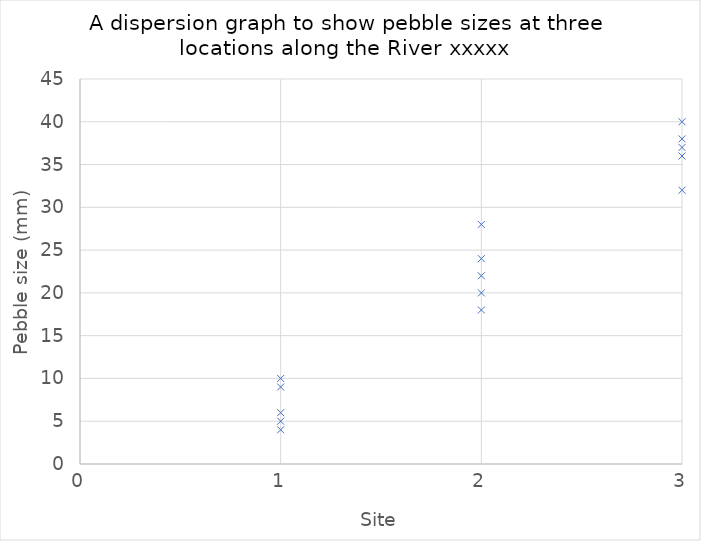
| Category | Series 0 |
|---|---|
| 1.0 | 5 |
| 1.0 | 9 |
| 1.0 | 6 |
| 1.0 | 10 |
| 1.0 | 4 |
| 2.0 | 18 |
| 2.0 | 20 |
| 2.0 | 24 |
| 2.0 | 22 |
| 2.0 | 28 |
| 3.0 | 32 |
| 3.0 | 37 |
| 3.0 | 36 |
| 3.0 | 38 |
| 3.0 | 40 |